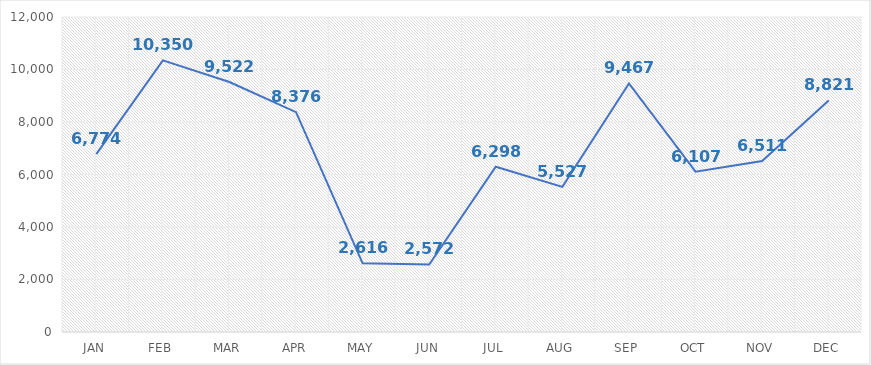
| Category | Series 0 |
|---|---|
| JAN | 6774 |
| FEB | 10350 |
| MAR | 9522 |
| APR | 8376 |
| MAY | 2616 |
| JUN | 2572 |
| JUL | 6298 |
| AUG | 5527 |
| SEP | 9467 |
| OCT | 6107 |
| NOV | 6511 |
| DEC | 8821 |